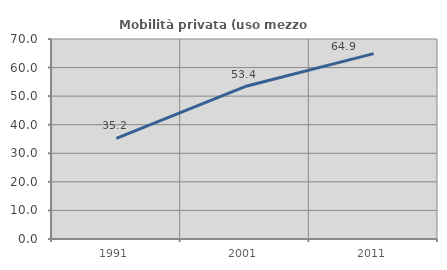
| Category | Mobilità privata (uso mezzo privato) |
|---|---|
| 1991.0 | 35.202 |
| 2001.0 | 53.353 |
| 2011.0 | 64.891 |